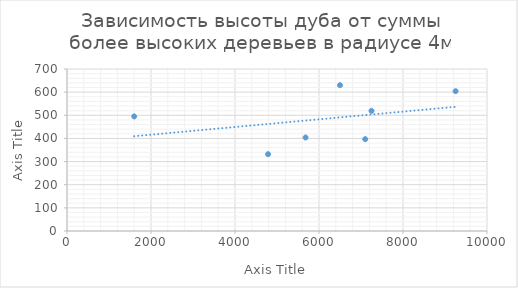
| Category | Series 0 |
|---|---|
| 5680.0 | 404 |
| 6500.0 | 630 |
| 4787.0 | 332 |
| 7250.0 | 519 |
| 1600.0 | 495 |
| 7100.0 | 397 |
| 9252.0 | 604 |